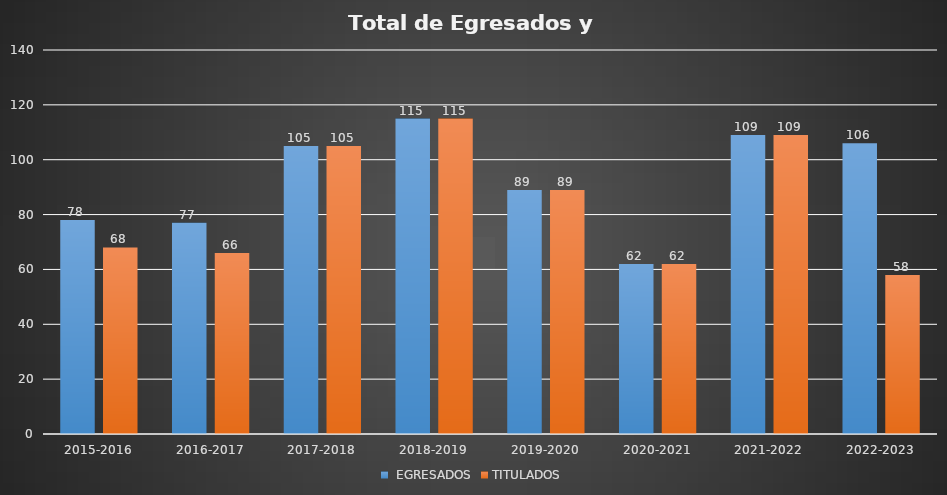
| Category |  EGRESADOS | TITULADOS |
|---|---|---|
| 2015-2016 | 78 | 68 |
| 2016-2017 | 77 | 66 |
| 2017-2018 | 105 | 105 |
| 2018-2019 | 115 | 115 |
| 2019-2020 | 89 | 89 |
| 2020-2021 | 62 | 62 |
| 2021-2022 | 109 | 109 |
| 2022-2023 | 106 | 58 |